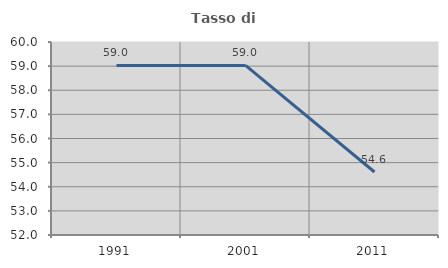
| Category | Tasso di occupazione   |
|---|---|
| 1991.0 | 59.027 |
| 2001.0 | 59.031 |
| 2011.0 | 54.612 |